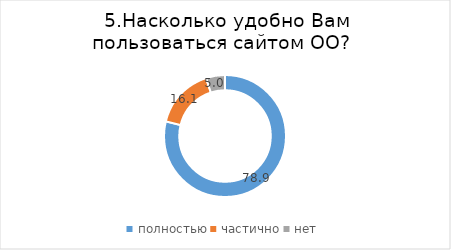
| Category | Series 0 |
|---|---|
| полностью | 78.853 |
| частично | 16.129 |
| нет | 5.018 |